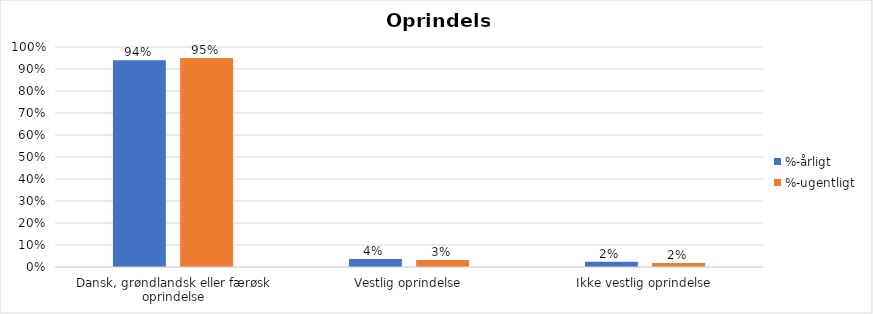
| Category | %-årligt | %-ugentligt |
|---|---|---|
| Dansk, grøndlandsk eller færøsk oprindelse | 0.94 | 0.95 |
| Vestlig oprindelse | 0.037 | 0.032 |
| Ikke vestlig oprindelse | 0.024 | 0.018 |